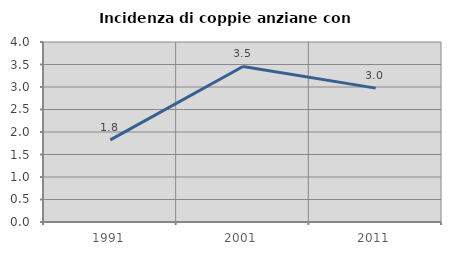
| Category | Incidenza di coppie anziane con figli |
|---|---|
| 1991.0 | 1.824 |
| 2001.0 | 3.456 |
| 2011.0 | 2.975 |